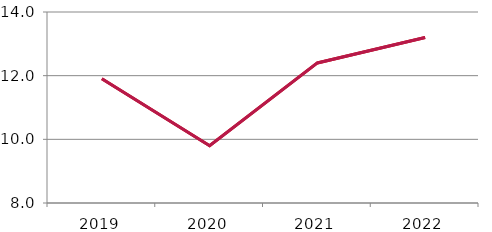
| Category | Rok | Hodnota |
|---|---|---|
| 2019.0 | 11.9 | 11.9 |
| 2020.0 | 9.8 | 9.8 |
| 2021.0 | 12.4 | 12.4 |
| 2022.0 | 13.2 | 13.2 |